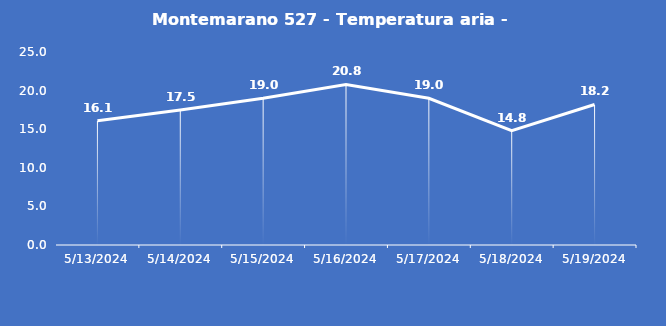
| Category | Montemarano 527 - Temperatura aria - Grezzo (°C) |
|---|---|
| 5/13/24 | 16.1 |
| 5/14/24 | 17.5 |
| 5/15/24 | 19 |
| 5/16/24 | 20.8 |
| 5/17/24 | 19 |
| 5/18/24 | 14.8 |
| 5/19/24 | 18.2 |